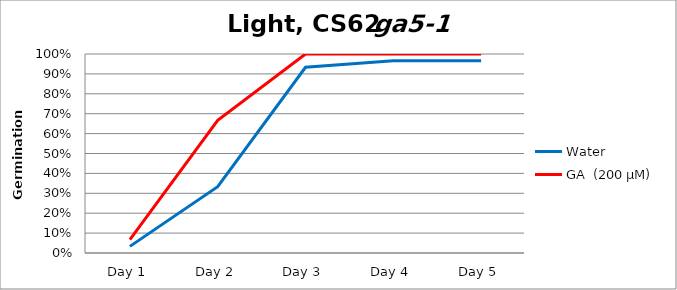
| Category | Water | GA  (200 µM)  |
|---|---|---|
| Day 1 | 0.033 | 0.067 |
| Day 2 | 0.333 | 0.667 |
| Day 3 | 0.933 | 1 |
| Day 4 | 0.967 | 1 |
| Day 5 | 0.967 | 1 |